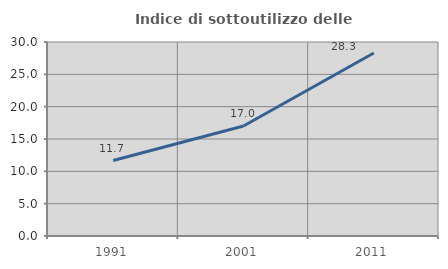
| Category | Indice di sottoutilizzo delle abitazioni  |
|---|---|
| 1991.0 | 11.671 |
| 2001.0 | 17.017 |
| 2011.0 | 28.293 |